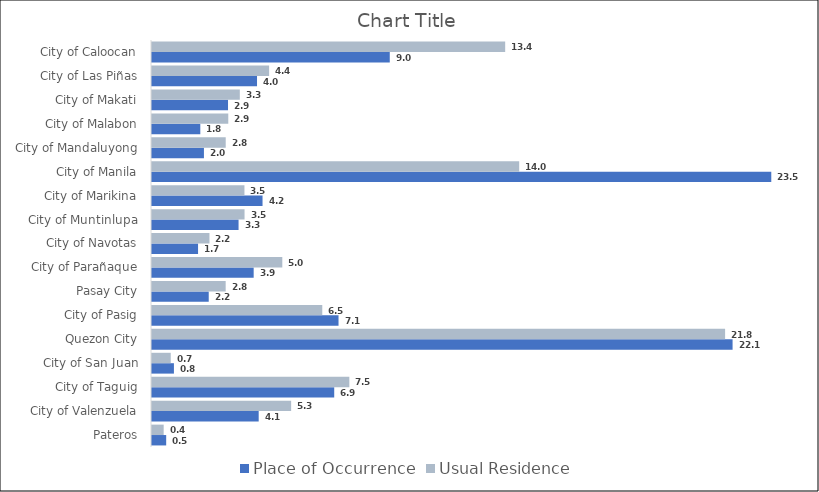
| Category |  Place of Occurrence  |  Usual Residence  |
|---|---|---|
|  Pateros | 0.539 | 0.444 |
|  City of Valenzuela | 4.054 | 5.286 |
|  City of Taguig | 6.923 | 7.498 |
|  City of San Juan | 0.833 | 0.712 |
|  Quezon City | 22.058 | 21.774 |
|  City of Pasig | 7.087 | 6.469 |
|  Pasay City | 2.155 | 2.799 |
|  City of Parañaque | 3.863 | 4.951 |
|  City of Navotas | 1.75 | 2.183 |
|  City of Muntinlupa | 3.289 | 3.516 |
|  City of Marikina | 4.2 | 3.512 |
|  City of Manila | 23.529 | 13.951 |
|  City of Mandaluyong | 1.973 | 2.801 |
|  City of Malabon | 1.835 | 2.898 |
|  City of Makati | 2.888 | 3.337 |
|  City of Las Piñas | 3.99 | 4.45 |
|  City of Caloocan | 9.034 | 13.419 |